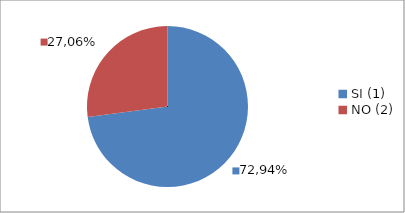
| Category | Series 0 |
|---|---|
| SI (1) | 0.729 |
| NO (2) | 0.271 |